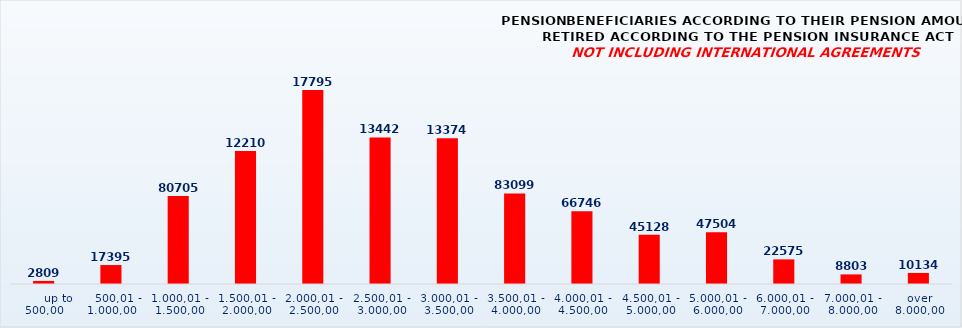
| Category | PENSION BENEFICIARIES ACCORDING TO TYPES AND AMOUNTS OF PENSION, RETIRED ACCORDING TO THE PENSION INSURANCE ACT
NOT INCLUDING INTERNATIONAL AGREEMENTS |
|---|---|
|       up to 500,00 | 2809 |
|    500,01 - 1.000,00 | 17395 |
| 1.000,01 - 1.500,00 | 80705 |
| 1.500,01 - 2.000,00 | 122100 |
| 2.000,01 - 2.500,00 | 177954 |
| 2.500,01 - 3.000,00 | 134426 |
| 3.000,01 - 3.500,00 | 133741 |
| 3.500,01 - 4.000,00 | 83099 |
| 4.000,01 - 4.500,00 | 66746 |
| 4.500,01 - 5.000,00 | 45128 |
| 5.000,01 - 6.000,00 | 47504 |
| 6.000,01 - 7.000,00 | 22575 |
| 7.000,01 - 8.000,00 | 8803 |
|  over  8.000,00 | 10134 |